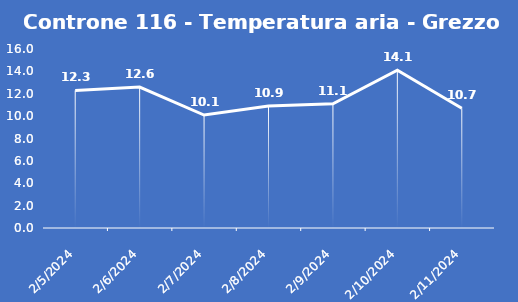
| Category | Controne 116 - Temperatura aria - Grezzo (°C) |
|---|---|
| 2/5/24 | 12.3 |
| 2/6/24 | 12.6 |
| 2/7/24 | 10.1 |
| 2/8/24 | 10.9 |
| 2/9/24 | 11.1 |
| 2/10/24 | 14.1 |
| 2/11/24 | 10.7 |